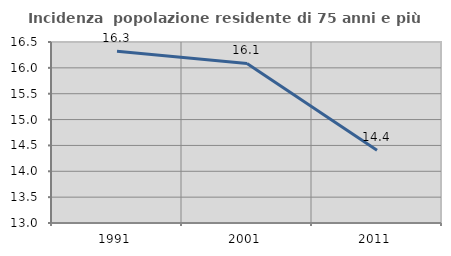
| Category | Incidenza  popolazione residente di 75 anni e più |
|---|---|
| 1991.0 | 16.319 |
| 2001.0 | 16.085 |
| 2011.0 | 14.405 |